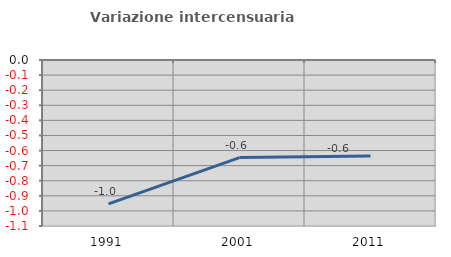
| Category | Variazione intercensuaria annua |
|---|---|
| 1991.0 | -0.953 |
| 2001.0 | -0.647 |
| 2011.0 | -0.636 |